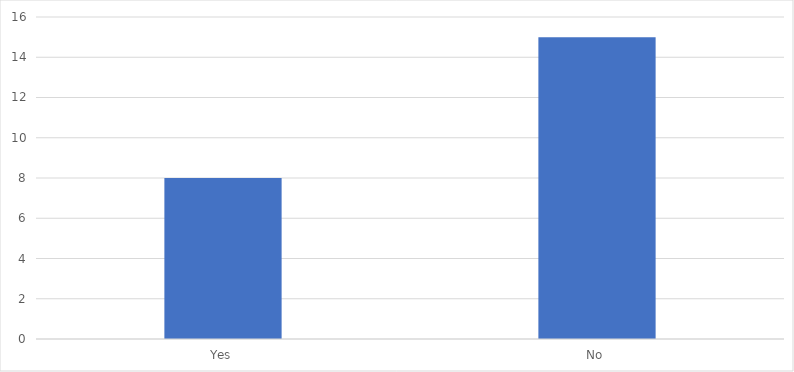
| Category | Number of Responses |
|---|---|
| Yes | 8 |
| No | 15 |